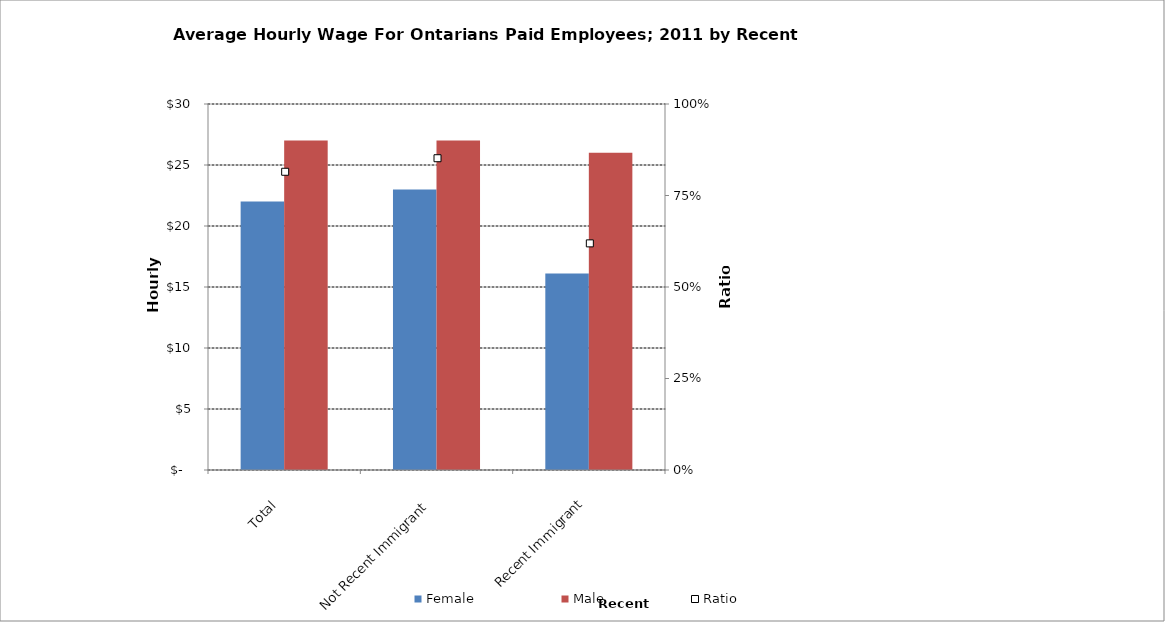
| Category | Female | Male |
|---|---|---|
| Total | 22 | 27 |
|  Not Recent Immigrant  | 23 | 27 |
|  Recent Immigrant  | 16.1 | 26 |